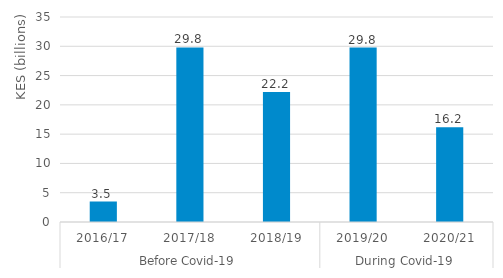
| Category | Agriculture |
|---|---|
| 0 | 3.5 |
| 1 | 29.8 |
| 2 | 22.206 |
| 3 | 29.791 |
| 4 | 16.163 |